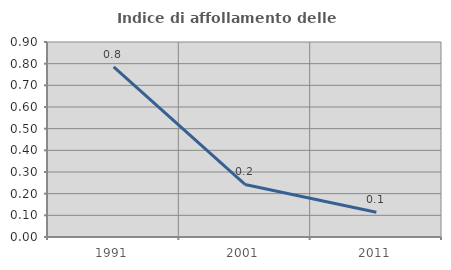
| Category | Indice di affollamento delle abitazioni  |
|---|---|
| 1991.0 | 0.785 |
| 2001.0 | 0.242 |
| 2011.0 | 0.115 |